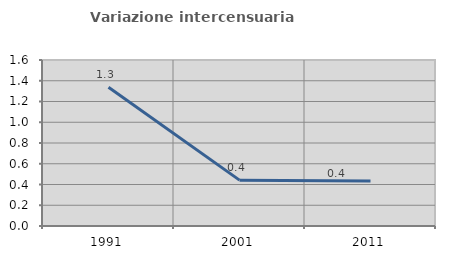
| Category | Variazione intercensuaria annua |
|---|---|
| 1991.0 | 1.337 |
| 2001.0 | 0.442 |
| 2011.0 | 0.434 |